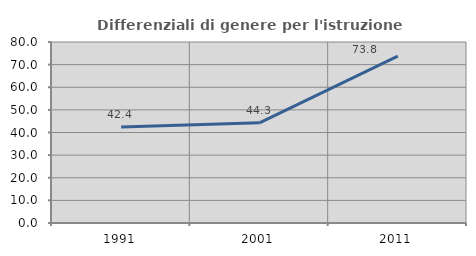
| Category | Differenziali di genere per l'istruzione superiore |
|---|---|
| 1991.0 | 42.4 |
| 2001.0 | 44.291 |
| 2011.0 | 73.79 |